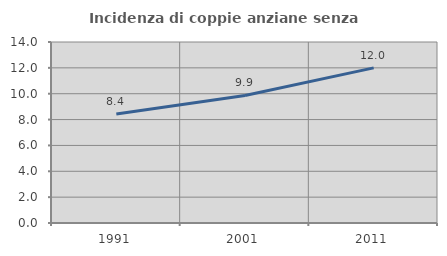
| Category | Incidenza di coppie anziane senza figli  |
|---|---|
| 1991.0 | 8.432 |
| 2001.0 | 9.866 |
| 2011.0 | 12 |